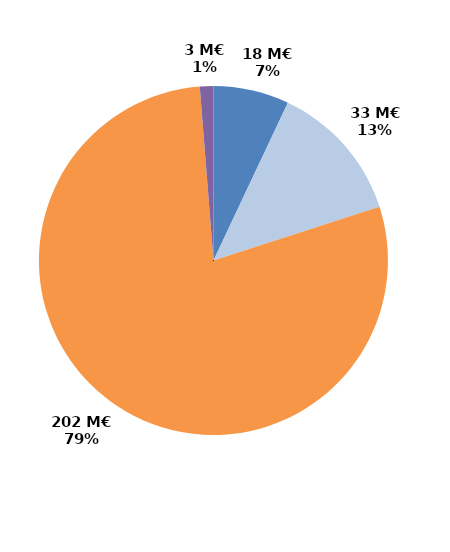
| Category | Series 0 |
|---|---|
| CIF - CPF | 17.958 |
| Période de professionnalisation | 33.297 |
| Plan de formation | 201.702 |
| Autres | 3.217 |